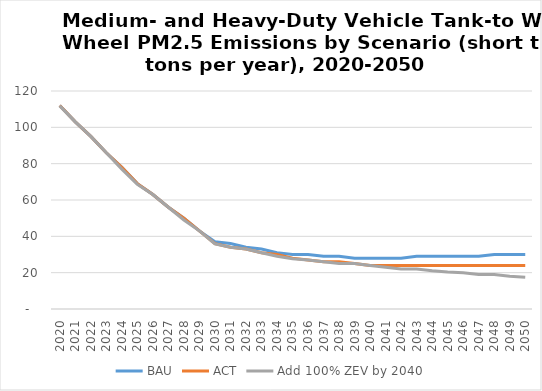
| Category | BAU | ACT | Add 100% ZEV by 2040 |
|---|---|---|---|
| 2020.0 | 112 | 112 | 111.833 |
| 2021.0 | 103 | 103 | 103 |
| 2022.0 | 95 | 95 | 95 |
| 2023.0 | 86 | 86 | 86 |
| 2024.0 | 78 | 78 | 77 |
| 2025.0 | 69 | 69 | 68.567 |
| 2026.0 | 63 | 63 | 63 |
| 2027.0 | 56 | 56 | 56 |
| 2028.0 | 50 | 50 | 49 |
| 2029.0 | 43 | 43 | 43 |
| 2030.0 | 37 | 36 | 35.814 |
| 2031.0 | 36 | 34 | 34 |
| 2032.0 | 34 | 33 | 33 |
| 2033.0 | 33 | 31 | 31 |
| 2034.0 | 31 | 30 | 29 |
| 2035.0 | 30 | 28 | 27.637 |
| 2036.0 | 30 | 27 | 27 |
| 2037.0 | 29 | 26 | 26 |
| 2038.0 | 29 | 26 | 25 |
| 2039.0 | 28 | 25 | 25 |
| 2040.0 | 28 | 24 | 23.907 |
| 2041.0 | 28 | 24 | 23 |
| 2042.0 | 28 | 24 | 22 |
| 2043.0 | 29 | 24 | 22 |
| 2044.0 | 29 | 24 | 21 |
| 2045.0 | 29 | 24 | 20.355 |
| 2046.0 | 29 | 24 | 20 |
| 2047.0 | 29 | 24 | 19 |
| 2048.0 | 30 | 24 | 19 |
| 2049.0 | 30 | 24 | 18 |
| 2050.0 | 30 | 24 | 17.478 |